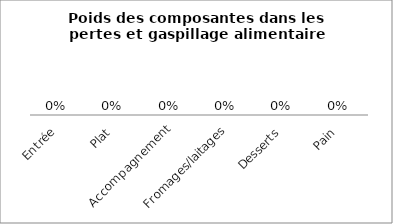
| Category | Series 0 | Series 1 | Series 2 |
|---|---|---|---|
| Entrée |  |  | 0 |
| Plat |  |  | 0 |
| Accompagnement |  |  | 0 |
| Fromages/laitages |  |  | 0 |
| Desserts |  |  | 0 |
| Pain |  |  | 0 |